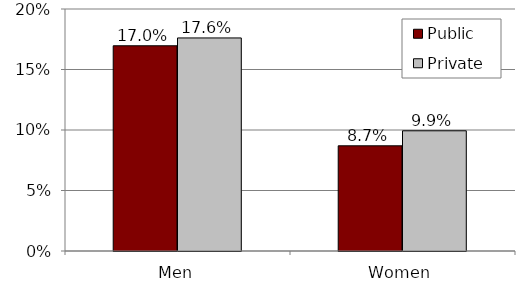
| Category | Public | Private |
|---|---|---|
| Men | 0.17 | 0.176 |
| Women | 0.087 | 0.099 |